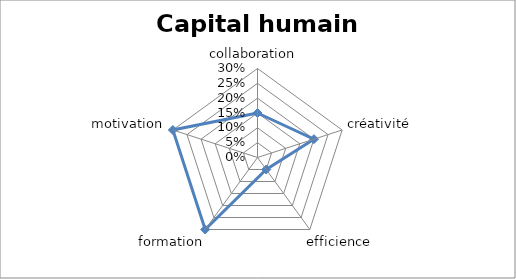
| Category | Series 0 |
|---|---|
| collaboration  | 0.15 |
| créativité | 0.2 |
| efficience | 0.05 |
| formation | 0.3 |
| motivation | 0.3 |